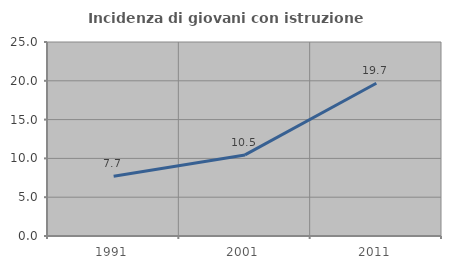
| Category | Incidenza di giovani con istruzione universitaria |
|---|---|
| 1991.0 | 7.706 |
| 2001.0 | 10.451 |
| 2011.0 | 19.688 |